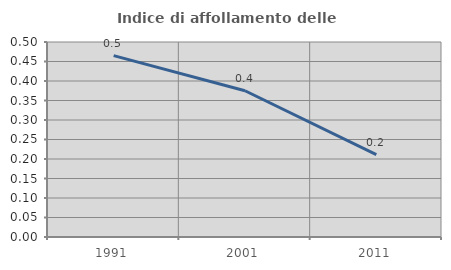
| Category | Indice di affollamento delle abitazioni  |
|---|---|
| 1991.0 | 0.465 |
| 2001.0 | 0.375 |
| 2011.0 | 0.211 |